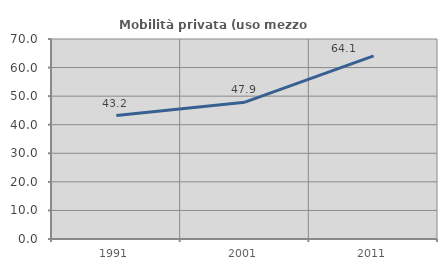
| Category | Mobilità privata (uso mezzo privato) |
|---|---|
| 1991.0 | 43.207 |
| 2001.0 | 47.879 |
| 2011.0 | 64.12 |